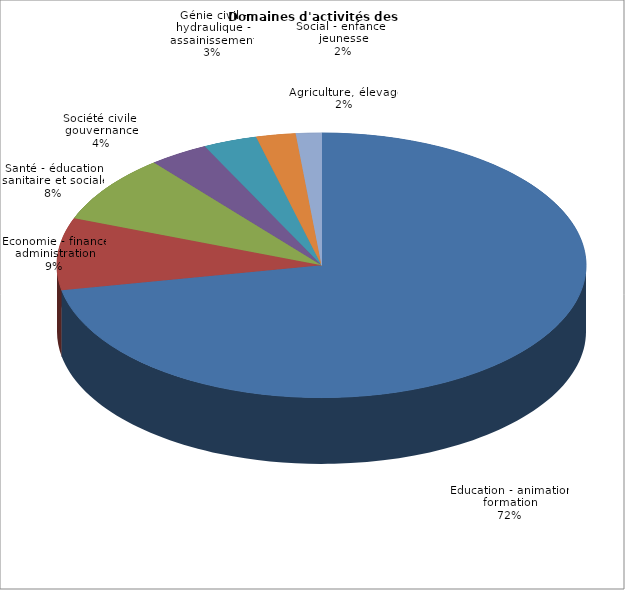
| Category | Nombre de volontaires | % |
|---|---|---|
| Education - animation - formation | 416 | 0.718 |
| Economie - finance - administration | 51 | 0.088 |
| Santé - éducation sanitaire et sociale | 48 | 0.083 |
| Société civile, gouvernance | 21 | 0.036 |
| Génie civil - hydraulique - assainissement | 19 | 0.033 |
| Agriculture, élevage | 14 | 0.024 |
| Social - enfance - jeunesse | 9 | 0.016 |